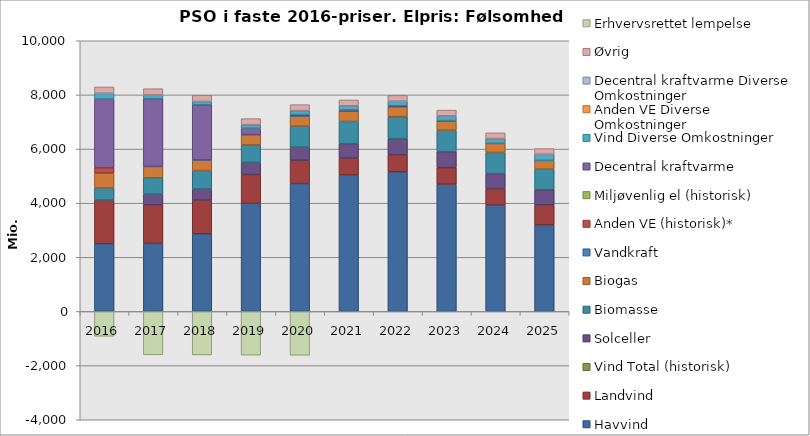
| Category | Havvind | Landvind | Vind Total (historisk) | Solceller | Biomasse | Biogas | Vandkraft | Anden VE (historisk)* | Miljøvenlig el (historisk) | Decentral kraftvarme | Vind Diverse Omkostninger | Anden VE Diverse Omkostninger | Decentral kraftvarme Diverse Omkostninger | Øvrig | Erhvervsrettet lempelse |
|---|---|---|---|---|---|---|---|---|---|---|---|---|---|---|---|
| 2016 | 2503.6 | 1615.534 | 0 | 0 | 442.278 | 552.308 | 0 | 195.5 | 0 | 2539.565 | 208.025 | 0 | 6.18 | 231.18 | -915.921 |
| 2017 | 2516.913 | 1428.856 | 0 | 388.036 | 604.255 | 418.933 | 3.251 | 0 | 0 | 2500.336 | 132.453 | 0 | 6.913 | 229.085 | -1602.039 |
| 2018 | 2869.666 | 1245.281 | 0 | 409.597 | 683.366 | 386.72 | 3.002 | 0 | 0 | 2036.574 | 118.338 | 0 | 6.775 | 225.301 | -1604.96 |
| 2019 | 3995.39 | 1064.297 | 0 | 449.237 | 644.559 | 378.523 | 2.943 | 0 | 0 | 231.071 | 128.304 | 0 | 6.659 | 222.225 | -1612.378 |
| 2020 | 4726.852 | 859.178 | 0 | 486.214 | 776.156 | 373.642 | 2.879 | 0 | 0 | 51.538 | 138.176 | 0 | 6.533 | 218.792 | -1616.669 |
| 2021 | 5042.629 | 623.095 | 0 | 534.609 | 821.05 | 377.219 | 2.824 | 0 | 0 | 42.408 | 148.486 | 0 | 6.427 | 216.038 | 0 |
| 2022 | 5158.482 | 634.792 | 0 | 592.515 | 810.739 | 369.374 | 2.77 | 0 | 0 | 29.335 | 164.486 | 0 | 6.323 | 213.301 | 0 |
| 2023 | 4703.398 | 608.807 | 0 | 590.657 | 793.322 | 346.864 | 2.717 | 0 | 0 | 8.895 | 168.454 | 0 | 6.22 | 210.587 | 0 |
| 2024 | 3929.761 | 610.034 | 0 | 554.804 | 780.515 | 333.556 | 2.665 | 0 | 0 | 3.318 | 168.976 | 0 | 6.12 | 207.963 | 0 |
| 2025 | 3203.681 | 733.437 | 0 | 558.144 | 764.303 | 320.183 | 2.614 | 0 | 0 | 0 | 221.974 | 0 | 6.022 | 205.398 | 0 |